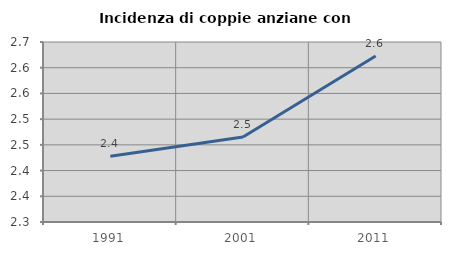
| Category | Incidenza di coppie anziane con figli |
|---|---|
| 1991.0 | 2.428 |
| 2001.0 | 2.465 |
| 2011.0 | 2.623 |